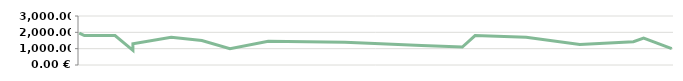
| Category | ERTRAG |
|---|---|
| 2013-04-23 | 1950 |
| 2013-04-25 | 1800 |
| 2013-05-07 | 1800 |
| 2013-05-14 | 900 |
| 2013-05-14 | 1300 |
| 2013-05-29 | 1700 |
| 2013-06-10 | 1500 |
| 2013-06-21 | 1000 |
| 2013-07-06 | 1450 |
| 2013-08-05 | 1400 |
| 2013-08-19 | 1300 |
| 2013-09-04 | 1200 |
| 2013-09-20 | 1100 |
| 2013-09-25 | 1800 |
| 2013-10-15 | 1700 |
| 2013-11-05 | 1250 |
| 2013-11-26 | 1425 |
| 2013-11-30 | 1650 |
| 2013-12-11 | 1000 |